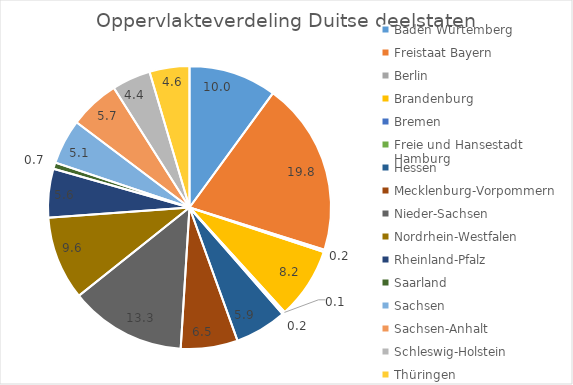
| Category | Series 0 |
|---|---|
| Baden Würtemberg | 10.035 |
| Freistaat Bayern | 19.799 |
| Berlin | 0.25 |
| Brandenburg | 8.155 |
| Bremen | 0.113 |
| Freie und Hansestadt Hamburg | 0.212 |
| Hessen | 5.927 |
| Mecklenburg-Vorpommern | 6.504 |
| Nieder-Sachsen | 13.289 |
| Nordrhein-Westfalen | 9.563 |
| Rheinland-Pfalz | 5.571 |
| Saarland | 0.721 |
| Sachsen | 5.147 |
| Sachsen-Anhalt | 5.736 |
| Schleswig-Holstein | 4.416 |
| Thüringen | 4.562 |